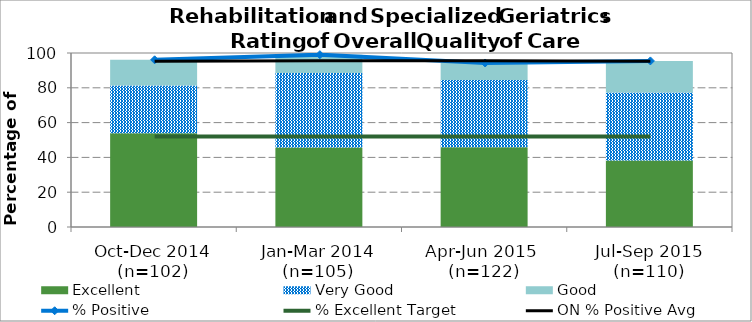
| Category | Excellent | Very Good | Good |
|---|---|---|---|
| Oct-Dec 2014 (n=102) | 53.92 | 27.45 | 14.71 |
| Jan-Mar 2014 (n=105) | 45.71 | 42.86 | 10.48 |
| Apr-Jun 2015 
(n=122) | 45.9 | 38.52 | 9.84 |
| Jul-Sep 2015 (n=110) | 38.18 | 39.09 | 18.18 |